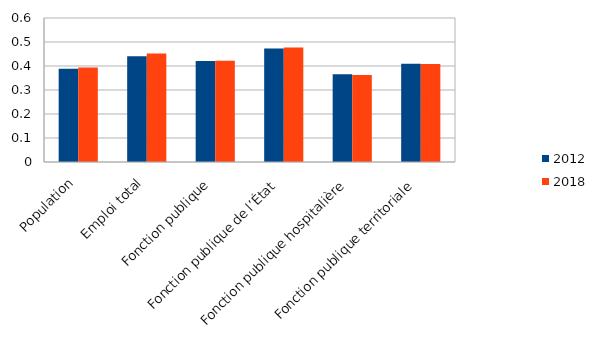
| Category | 2012 | 2018 |
|---|---|---|
| Population | 0.388 | 0.394 |
| Emploi total | 0.441 | 0.452 |
| Fonction publique | 0.421 | 0.421 |
| Fonction publique de l’État | 0.473 | 0.477 |
| Fonction publique hospitalière | 0.366 | 0.362 |
| Fonction publique territoriale | 0.409 | 0.409 |